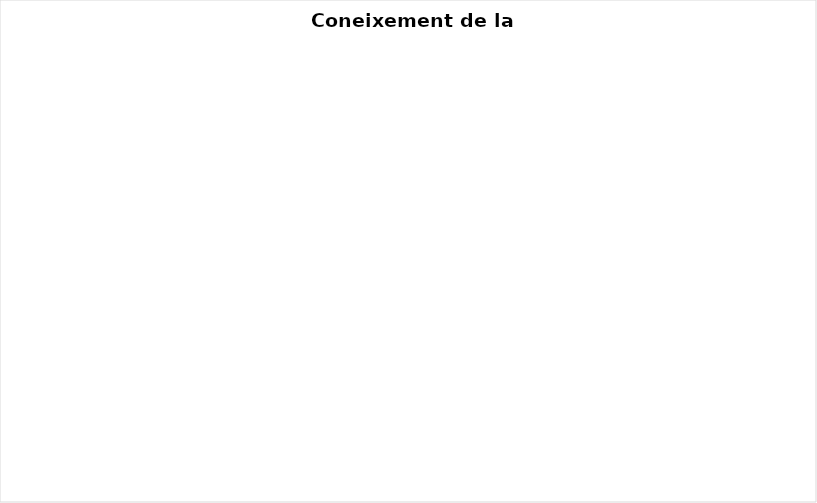
| Category | % Respostes |
|---|---|
| A través de la meva entitat | 0 |
| A través de la Generalitat de Catalunya | 0 |
| A través d'internet | 0 |
| Altres | 0 |
| A través de l'Ajuntament | 0 |
| Pel boca orella | 0 |
| A través de la premsa | 0 |